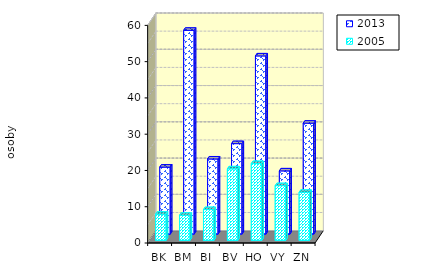
| Category | 2013 | 2005 |
|---|---|---|
| BK | 18.488 | 7.204 |
| BM | 56.2 | 6.905 |
| BI | 20.726 | 8.484 |
| BV | 24.955 | 19.71 |
| HO | 49.14 | 21.173 |
| VY | 17.44 | 15.08 |
| ZN | 30.6 | 13.24 |